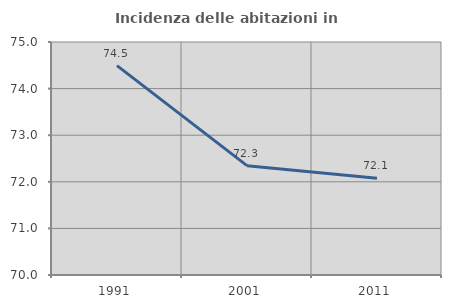
| Category | Incidenza delle abitazioni in proprietà  |
|---|---|
| 1991.0 | 74.494 |
| 2001.0 | 72.346 |
| 2011.0 | 72.078 |